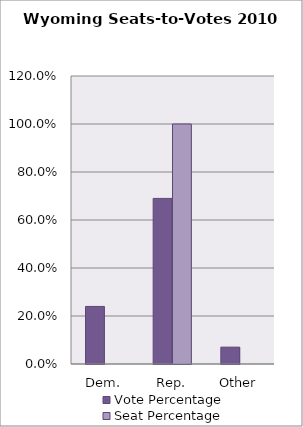
| Category | Vote Percentage | Seat Percentage |
|---|---|---|
| 0 | 0.24 | 0 |
| 1 | 0.69 | 1 |
| 2 | 0.07 | 0 |